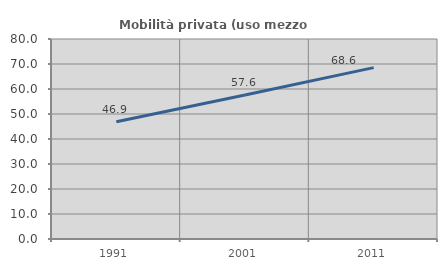
| Category | Mobilità privata (uso mezzo privato) |
|---|---|
| 1991.0 | 46.891 |
| 2001.0 | 57.59 |
| 2011.0 | 68.561 |